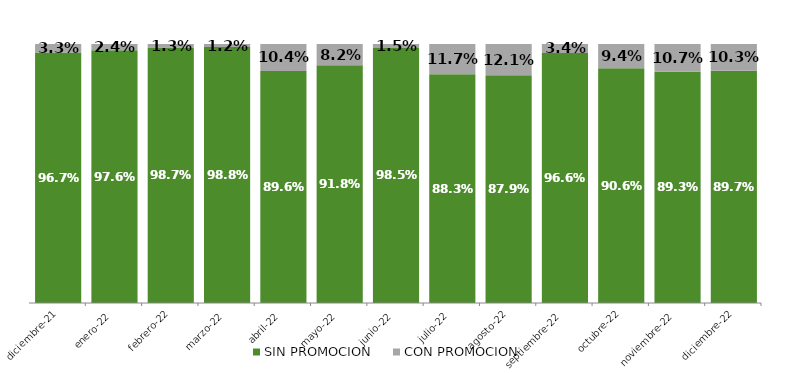
| Category | SIN PROMOCION   | CON PROMOCION   |
|---|---|---|
| 2021-12-01 | 0.967 | 0.033 |
| 2022-01-01 | 0.976 | 0.024 |
| 2022-02-01 | 0.987 | 0.013 |
| 2022-03-01 | 0.988 | 0.012 |
| 2022-04-01 | 0.896 | 0.104 |
| 2022-05-01 | 0.918 | 0.082 |
| 2022-06-01 | 0.985 | 0.015 |
| 2022-07-01 | 0.883 | 0.117 |
| 2022-08-01 | 0.879 | 0.121 |
| 2022-09-01 | 0.966 | 0.034 |
| 2022-10-01 | 0.906 | 0.094 |
| 2022-11-01 | 0.893 | 0.107 |
| 2022-12-01 | 0.897 | 0.103 |